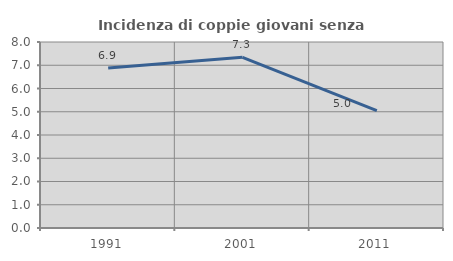
| Category | Incidenza di coppie giovani senza figli |
|---|---|
| 1991.0 | 6.881 |
| 2001.0 | 7.341 |
| 2011.0 | 5.049 |